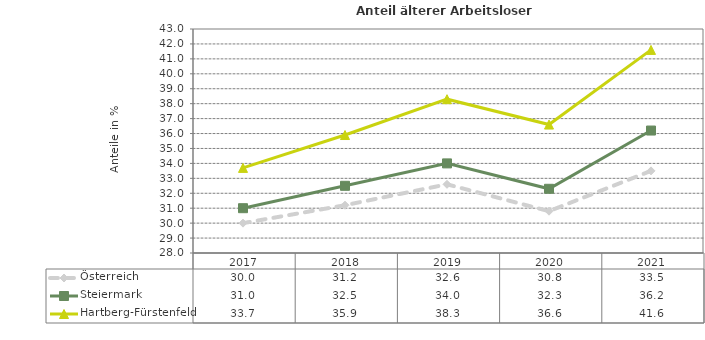
| Category | Österreich | Steiermark | Hartberg-Fürstenfeld |
|---|---|---|---|
| 2021.0 | 33.5 | 36.2 | 41.6 |
| 2020.0 | 30.8 | 32.3 | 36.6 |
| 2019.0 | 32.6 | 34 | 38.3 |
| 2018.0 | 31.2 | 32.5 | 35.9 |
| 2017.0 | 30 | 31 | 33.7 |